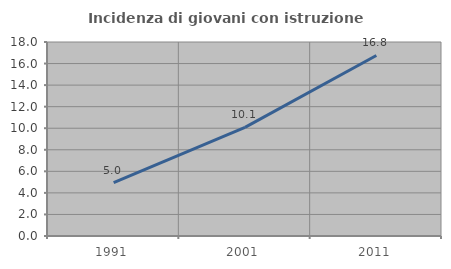
| Category | Incidenza di giovani con istruzione universitaria |
|---|---|
| 1991.0 | 4.954 |
| 2001.0 | 10.079 |
| 2011.0 | 16.752 |